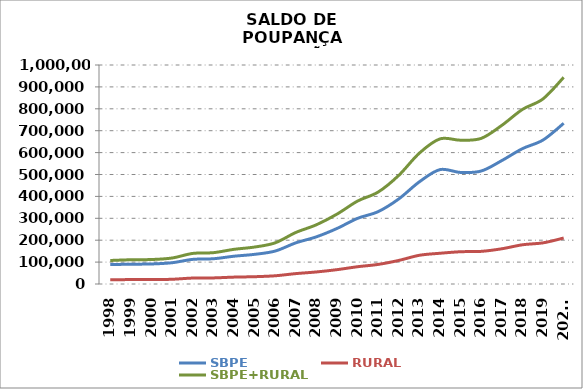
| Category | SBPE | RURAL | SBPE+RURAL |
|---|---|---|---|
| 1998 | 88538.349 | 18883.24 | 107421.589 |
| 1999 | 90437.74 | 20294.123 | 110731.863 |
| 2000 | 91430.45 | 20310.891 | 111741.341 |
| 2001 | 97146.25 | 21552.598 | 118698.848 |
| 2002 | 112423.444 | 27219.068 | 139642.512 |
| 2003 | 115258.021 | 27799.406 | 143057.427 |
| 2004 | 126853.217 | 31413.354 | 158266.571 |
| 2005 | 135411.681 | 33322.74 | 168734.421 |
| 2006 | 150412.546 | 37523.193 | 187935.739 |
| 2007 | 187827.264 | 47434.388 | 235261.652 |
| 2008 | 215400.282 | 54995.458 | 270395.74 |
| 2009 | 253604.98 | 65477.998 | 319082.978 |
| 2010 | 299878.217 | 78920.574 | 378798.791 |
| 2011 | 330569.272 | 89439.722 | 420008.994 |
| 2012 | 388641.662 | 107660.772 | 496302.434 |
| 2013 | 466788.644 | 131154.416 | 597943.06 |
| 2014 | 522343.501 | 140383.609 | 662727.11 |
| 2015 | 509223.044 | 147366.727 | 656589.771 |
| 2016 | 515955.43 | 149036.994 | 664992.424 |
| 2017 | 563741.675 | 160861.771 | 724603.446 |
| 2018 | 618146.063 | 179134.939 | 797281.002 |
| 2019 | 657531.442 | 187933.103 | 845464.545 |
| 2020* | 733706.661 | 209931.533 | 943638.194 |